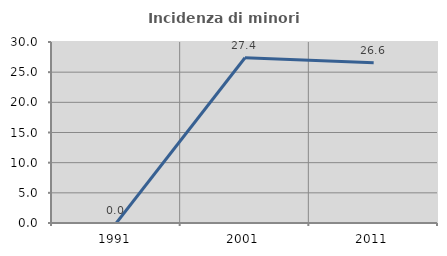
| Category | Incidenza di minori stranieri |
|---|---|
| 1991.0 | 0 |
| 2001.0 | 27.391 |
| 2011.0 | 26.571 |